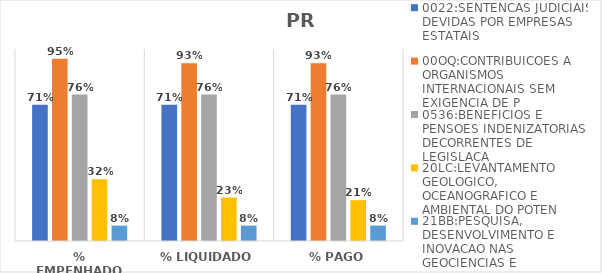
| Category | 0022:SENTENCAS JUDICIAIS DEVIDAS POR EMPRESAS ESTATAIS | 00OQ:CONTRIBUICOES A ORGANISMOS INTERNACIONAIS SEM EXIGENCIA DE P | 0536:BENEFICIOS E PENSOES INDENIZATORIAS DECORRENTES DE LEGISLACA | 20LC:LEVANTAMENTO GEOLOGICO, OCEANOGRAFICO E AMBIENTAL DO POTEN | 21BB:PESQUISA, DESENVOLVIMENTO E INOVACAO NAS GEOCIENCIAS E |
|---|---|---|---|---|---|
| % EMPENHADO | 0.71 | 0.95 | 0.763 | 0.321 | 0.08 |
| % LIQUIDADO | 0.71 | 0.926 | 0.763 | 0.226 | 0.08 |
| % PAGO | 0.71 | 0.926 | 0.763 | 0.213 | 0.08 |